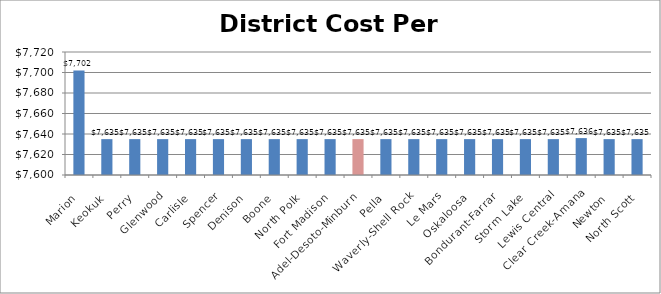
| Category | DCPP |
|---|---|
| Marion | 7702 |
| Keokuk | 7635 |
| Perry | 7635 |
| Glenwood | 7635 |
| Carlisle | 7635 |
| Spencer | 7635 |
| Denison | 7635 |
| Boone | 7635 |
| North Polk | 7635 |
| Fort Madison | 7635 |
| Adel-Desoto-Minburn | 7635 |
| Pella | 7635 |
| Waverly-Shell Rock | 7635 |
| Le Mars | 7635 |
| Oskaloosa | 7635 |
| Bondurant-Farrar | 7635 |
| Storm Lake | 7635 |
| Lewis Central | 7635 |
| Clear Creek-Amana | 7636 |
| Newton | 7635 |
| North Scott | 7635 |